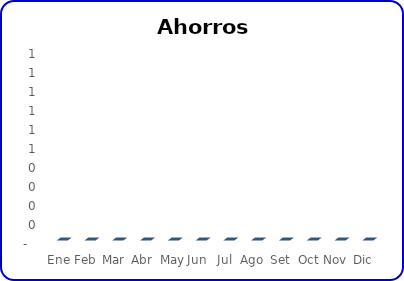
| Category | Total ahorros |
|---|---|
| Ene | 0 |
| Feb | 0 |
| Mar | 0 |
| Abr | 0 |
| May | 0 |
| Jun | 0 |
| Jul | 0 |
| Ago | 0 |
| Set | 0 |
| Oct | 0 |
| Nov | 0 |
| Dic | 0 |